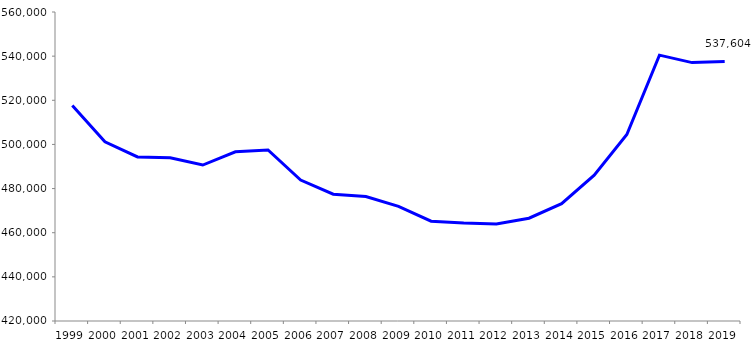
| Category | 1999 2000 2001 2002 2003 2004 2005 2006 2007 2008 2009 2010 2011 2012 2013 2014 2015 2016 2017 2018 2019 |
|---|---|
| 1999 | 517687 |
| 2000 | 501203 |
| 2001 | 494348 |
| 2002 | 493936 |
| 2003 | 490658 |
| 2004 | 496637 |
| 2005 | 497473 |
| 2006 | 483882 |
| 2007 | 477463 |
| 2008 | 476434 |
| 2009 | 471913 |
| 2010 | 465218 |
| 2011 | 464418 |
| 2012 | 464005 |
| 2013 | 466581 |
| 2014 | 473187 |
| 2015 | 486063 |
| 2016 | 504507 |
| 2017 | 540457 |
| 2018 | 537072 |
| 2019 | 537604 |